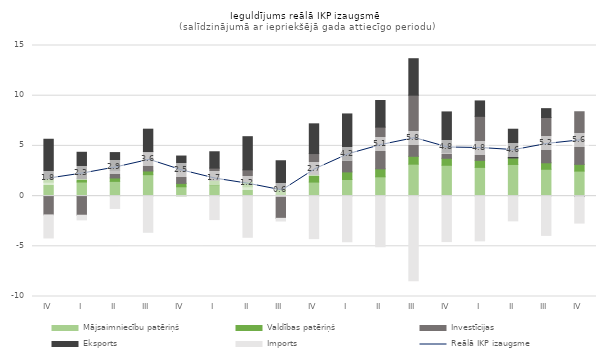
| Category | Mājsaimniecību patēriņš | Valdības patēriņš | Investīcijas | Eksports | Imports |
|---|---|---|---|---|---|
| IV | 1.386 | 0.335 | -1.874 | 3.941 | -2.295 |
| I | 1.402 | 0.329 | -1.906 | 2.634 | -0.459 |
| II | 1.467 | 0.34 | 0.764 | 1.764 | -1.229 |
| III | 2.135 | 0.367 | 1.903 | 2.26 | -3.606 |
| IV | 0.929 | 0.336 | 1.285 | 1.44 | -0.008 |
| I | 1.141 | 0.44 | 1.206 | 1.629 | -2.336 |
| II | 0.926 | 0.511 | 1.177 | 3.304 | -4.103 |
| III | 0.112 | 0.611 | -2.216 | 2.797 | -0.267 |
| IV | 1.396 | 0.766 | 2.076 | 2.96 | -4.233 |
| I | 1.652 | 0.758 | 1.161 | 4.612 | -4.545 |
| II | 1.922 | 0.794 | 4.155 | 2.651 | -5.044 |
| III | 3.18 | 0.784 | 6.088 | 3.633 | -8.438 |
| IV | 3.071 | 0.696 | 0.589 | 4.03 | -4.53 |
| I | 2.86 | 0.7 | 4.385 | 1.535 | -4.456 |
| II | 3.151 | 0.661 | 0.001 | 2.849 | -2.464 |
| III | 2.673 | 0.646 | 4.511 | 0.88 | -3.915 |
| IV | 2.49 | 0.673 | 5.239 | -0.045 | -2.641 |